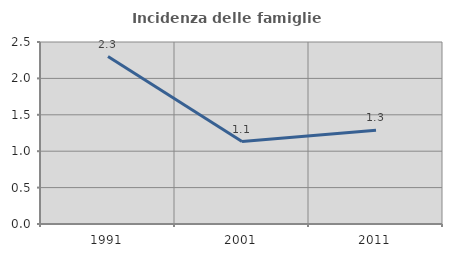
| Category | Incidenza delle famiglie numerose |
|---|---|
| 1991.0 | 2.3 |
| 2001.0 | 1.133 |
| 2011.0 | 1.288 |